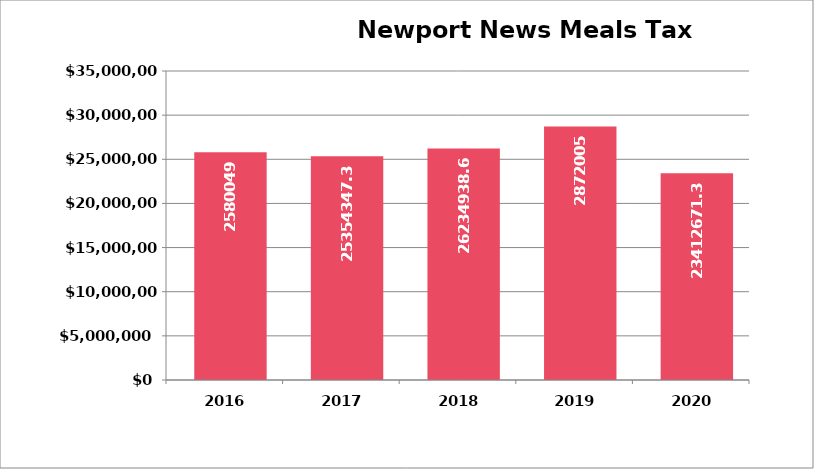
| Category | Series 0 | Series 1 |
|---|---|---|
| 2016.0 | 2016 | 25800497 |
| 2017.0 | 2017 | 25354347.31 |
| 2018.0 | 2018 | 26234938.69 |
| 2019.0 | 2019 | 28720058 |
| 2020.0 | 2020 | 23412671.37 |